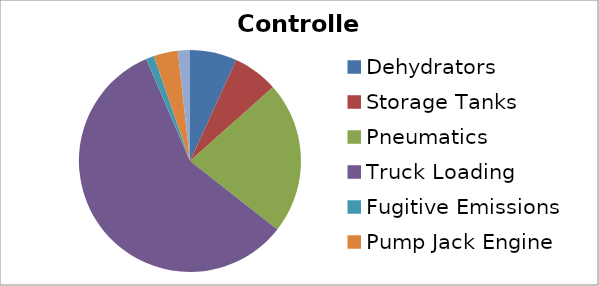
| Category | Controlled |
|---|---|
| Dehydrators | 0.927 |
| Storage Tanks | 0.894 |
| Pneumatics | 3 |
| Truck Loading | 7.85 |
| Fugitive Emissions | 0.162 |
| Pump Jack Engine | 0.478 |
| Heaters/Boilers | 0.236 |
| VOC Control Device | 0 |